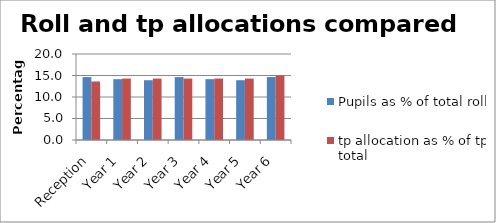
| Category | Pupils as % of total roll | tp allocation as % of tp total |
|---|---|---|
| Reception | 14.634 | 13.605 |
| Year 1 | 14.146 | 14.286 |
| Year 2 | 13.902 | 14.286 |
| Year 3 | 14.634 | 14.286 |
| Year 4 | 14.146 | 14.286 |
| Year 5 | 13.902 | 14.286 |
| Year 6 | 14.634 | 14.966 |